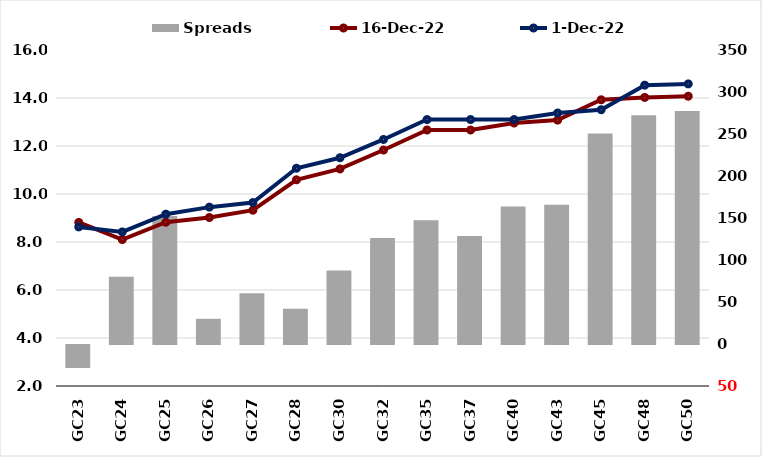
| Category |  Spreads   |
|---|---|
|  | -27.389 |
| GC23 | 80.195 |
| GC24 | 152.295 |
| GC25 | 29.994 |
| GC26 | 60.478 |
| GC27 | 42.091 |
| GC28 | 87.389 |
| GC30 | 126.187 |
| GC32 | 147.184 |
| GC35 | 128.684 |
| GC37 | 163.686 |
| GC40 | 165.842 |
| GC43 | 250.612 |
| GC45 | 272.347 |
| GC48 | 277.379 |